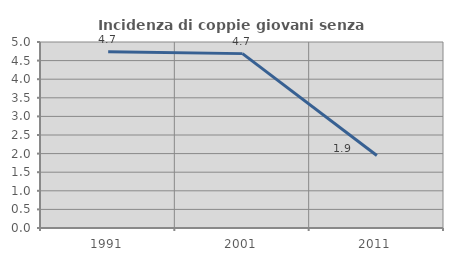
| Category | Incidenza di coppie giovani senza figli |
|---|---|
| 1991.0 | 4.74 |
| 2001.0 | 4.688 |
| 2011.0 | 1.948 |